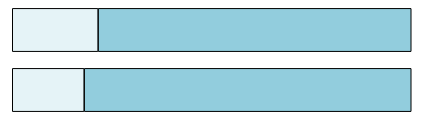
| Category | Series 0 | Series 1 |
|---|---|---|
| 0 | 3610 | 16412 |
| 1 | 4810 | 17537 |